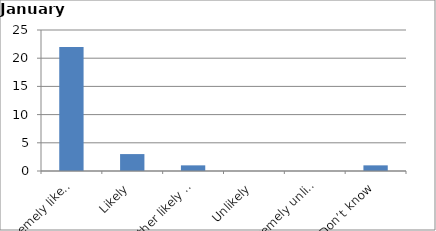
| Category | Series 0 |
|---|---|
| Extremely likely | 22 |
| Likely | 3 |
| Neither likely nor unlikely | 1 |
| Unlikely | 0 |
| Extremely unlikely | 0 |
| Don’t know | 1 |